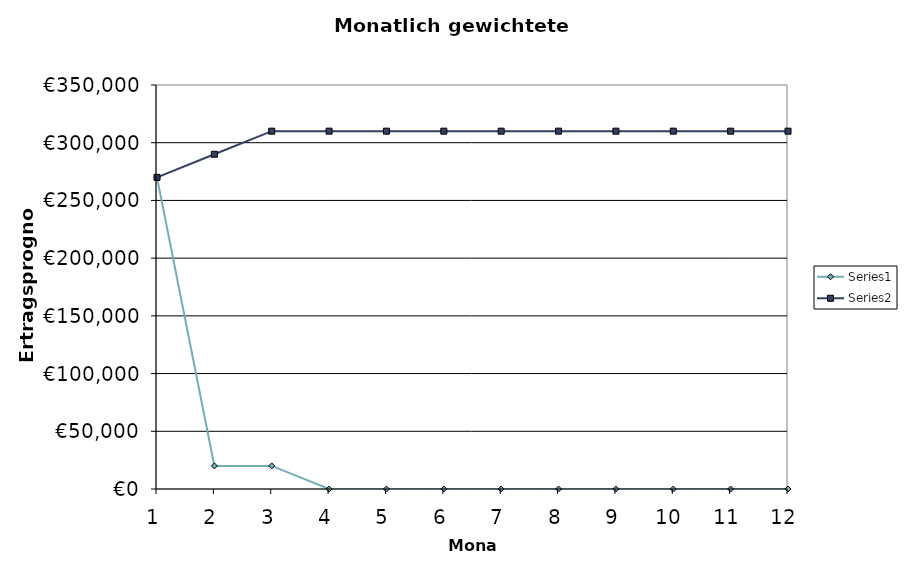
| Category | Series 0 | Series 1 |
|---|---|---|
| 0 | 270000 | 270000 |
| 1 | 20000 | 290000 |
| 2 | 20000 | 310000 |
| 3 | 0 | 310000 |
| 4 | 0 | 310000 |
| 5 | 0 | 310000 |
| 6 | 0 | 310000 |
| 7 | 0 | 310000 |
| 8 | 0 | 310000 |
| 9 | 0 | 310000 |
| 10 | 0 | 310000 |
| 11 | 0 | 310000 |